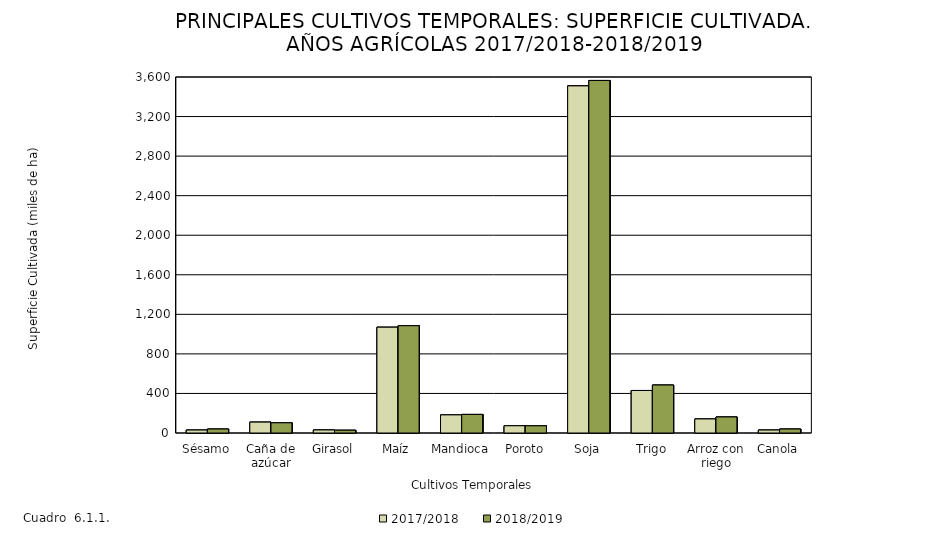
| Category | 2017/2018 | 2018/2019 |
|---|---|---|
| Sésamo | 30 | 40 |
| Caña de azúcar | 110 | 103 |
| Girasol | 30.5 | 28 |
| Maíz | 1070 | 1085.005 |
| Mandioca | 183 | 188 |
| Poroto | 73 | 72.8 |
| Soja | 3510 | 3565 |
| Trigo | 430 | 485 |
| Arroz con riego | 142 | 162 |
| Canola | 30 | 40 |